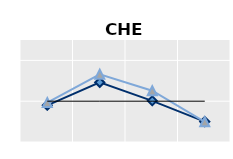
| Category | Foreign-born | Native-born | Series 1 |
|---|---|---|---|
| 15-24 | 0.899 | 0.965 | 1 |
| 25-54 | 1.462 | 1.66 | 1 |
| 55-64 | 1.009 | 1.257 | 1 |
| 65+ | 0.499 | 0.496 | 1 |